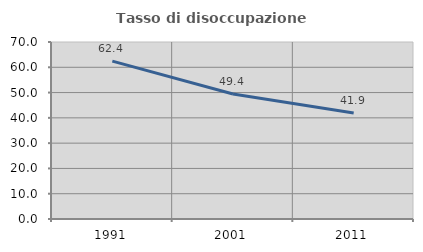
| Category | Tasso di disoccupazione giovanile  |
|---|---|
| 1991.0 | 62.424 |
| 2001.0 | 49.412 |
| 2011.0 | 41.935 |